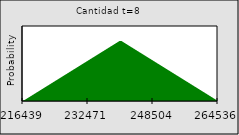
| Category | Series 0 |
|---|---|
| 216438.741780729 | 0 |
| nan | 0 |
| nan | 0.001 |
| nan | 0.001 |
| nan | 0.002 |
| nan | 0.002 |
| nan | 0.002 |
| nan | 0.003 |
| nan | 0.003 |
| nan | 0.004 |
| nan | 0.004 |
| nan | 0.004 |
| nan | 0.005 |
| nan | 0.005 |
| nan | 0.006 |
| nan | 0.006 |
| nan | 0.007 |
| nan | 0.007 |
| nan | 0.007 |
| nan | 0.008 |
| nan | 0.008 |
| nan | 0.009 |
| nan | 0.009 |
| nan | 0.009 |
| nan | 0.01 |
| nan | 0.01 |
| nan | 0.011 |
| nan | 0.011 |
| nan | 0.011 |
| nan | 0.012 |
| nan | 0.012 |
| nan | 0.013 |
| nan | 0.013 |
| 232471.24117189398 | 0.013 |
| nan | 0.014 |
| nan | 0.014 |
| nan | 0.015 |
| nan | 0.015 |
| nan | 0.016 |
| nan | 0.016 |
| nan | 0.016 |
| nan | 0.017 |
| nan | 0.017 |
| nan | 0.018 |
| nan | 0.018 |
| nan | 0.018 |
| nan | 0.019 |
| nan | 0.019 |
| nan | 0.02 |
| nan | 0.02 |
| nan | 0.02 |
| nan | 0.02 |
| nan | 0.019 |
| nan | 0.019 |
| nan | 0.018 |
| nan | 0.018 |
| nan | 0.018 |
| nan | 0.017 |
| nan | 0.017 |
| nan | 0.016 |
| nan | 0.016 |
| nan | 0.016 |
| nan | 0.015 |
| nan | 0.015 |
| nan | 0.014 |
| nan | 0.014 |
| 248503.740563059 | 0.013 |
| nan | 0.013 |
| nan | 0.013 |
| nan | 0.012 |
| nan | 0.012 |
| nan | 0.011 |
| nan | 0.011 |
| nan | 0.011 |
| nan | 0.01 |
| nan | 0.01 |
| nan | 0.009 |
| nan | 0.009 |
| nan | 0.009 |
| nan | 0.008 |
| nan | 0.008 |
| nan | 0.007 |
| nan | 0.007 |
| nan | 0.007 |
| nan | 0.006 |
| nan | 0.006 |
| nan | 0.005 |
| nan | 0.005 |
| nan | 0.004 |
| nan | 0.004 |
| nan | 0.004 |
| nan | 0.003 |
| nan | 0.003 |
| nan | 0.002 |
| nan | 0.002 |
| nan | 0.002 |
| nan | 0.001 |
| nan | 0.001 |
| nan | 0 |
| 264536.239954224 | 0 |